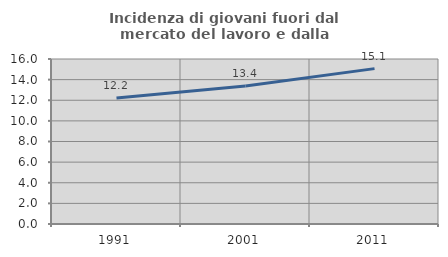
| Category | Incidenza di giovani fuori dal mercato del lavoro e dalla formazione  |
|---|---|
| 1991.0 | 12.215 |
| 2001.0 | 13.39 |
| 2011.0 | 15.066 |